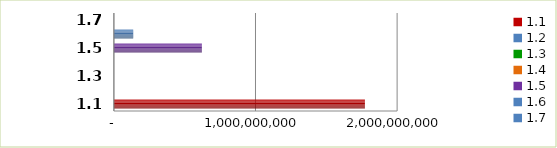
| Category | Series 0 |
|---|---|
| 1.1 | 1772568408.62 |
| 1.2 | 0 |
| 1.3 | 0 |
| 1.4 | 0 |
| 1.5 | 621231470.15 |
| 1.6 | 136594702.71 |
| 1.7 | 0 |